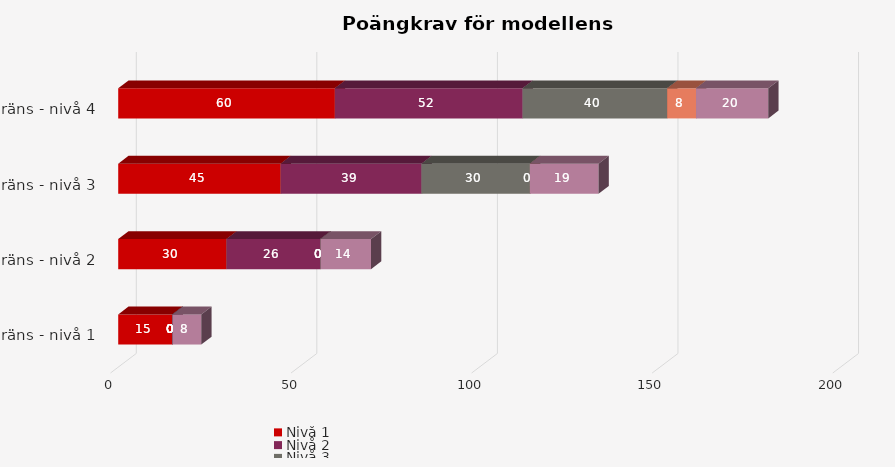
| Category | Nivå 1 | Nivå 2 | Nivå 3 | Nivå 4 | Rörlig poäng (poäng från valfri nivå och fråga) |
|---|---|---|---|---|---|
| Gräns - nivå 1 | 15 | 0 | 0 | 0 | 8 |
| Gräns - nivå 2 | 30 | 26 | 0 | 0 | 14 |
| Gräns - nivå 3 | 45 | 39 | 30 | 0 | 19 |
| Gräns - nivå 4 | 60 | 52 | 40 | 8 | 20 |